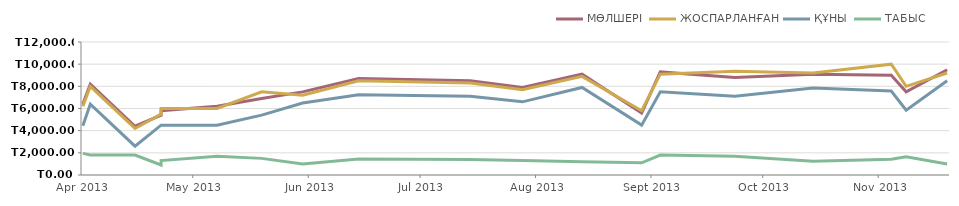
| Category | МӨЛШЕРІ | ЖОСПАРЛАНҒАН | ҚҰНЫ | ТАБЫС |
|---|---|---|---|---|
| 2013-04-23 | 6400 | 6200 | 4450 | 1950 |
| 2013-04-25 | 8200 | 8000 | 6400 | 1800 |
| 2013-05-07 | 4400 | 4200 | 2600 | 1800 |
| 2013-05-14 | 5400 | 5500 | 4500 | 900 |
| 2013-05-14 | 5800 | 6000 | 4500 | 1300 |
| 2013-05-29 | 6200 | 6000 | 4500 | 1700 |
| 2013-06-10 | 6900 | 7500 | 5400 | 1500 |
| 2013-06-21 | 7500 | 7200 | 6500 | 1000 |
| 2013-07-06 | 8700 | 8500 | 7250 | 1450 |
| 2013-08-05 | 8500 | 8300 | 7100 | 1400 |
| 2013-08-19 | 7900 | 7700 | 6600 | 1300 |
| 2013-09-04 | 9100 | 8900 | 7900 | 1200 |
| 2013-09-20 | 5600 | 5800 | 4500 | 1100 |
| 2013-09-25 | 9300 | 9100 | 7500 | 1800 |
| 2013-10-15 | 8800 | 9350 | 7100 | 1700 |
| 2013-11-05 | 9100 | 9200 | 7850 | 1250 |
| 2013-11-26 | 9000 | 10000 | 7575 | 1425 |
| 2013-11-30 | 7500 | 8000 | 5850 | 1650 |
| 2013-12-11 | 9500 | 9200 | 8500 | 1000 |